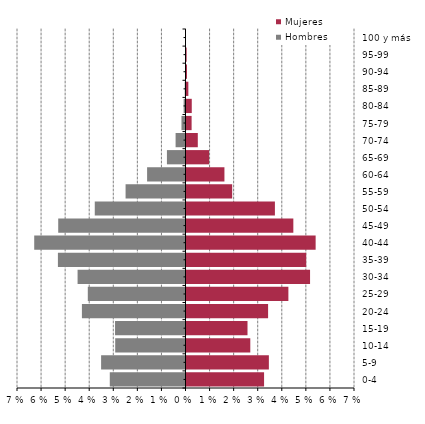
| Category | Hombres | Mujeres |
|---|---|---|
| 0-4 | -0.031 | 0.032 |
| 5-9 | -0.035 | 0.034 |
| 10-14 | -0.029 | 0.027 |
| 15-19 | -0.029 | 0.025 |
| 20-24 | -0.043 | 0.034 |
| 25-29 | -0.041 | 0.042 |
| 30-34 | -0.045 | 0.051 |
| 35-39 | -0.053 | 0.05 |
| 40-44 | -0.063 | 0.054 |
| 45-49 | -0.053 | 0.044 |
| 50-54 | -0.038 | 0.037 |
| 55-59 | -0.025 | 0.019 |
| 60-64 | -0.016 | 0.016 |
| 65-69 | -0.008 | 0.009 |
| 70-74 | -0.004 | 0.005 |
| 75-79 | -0.002 | 0.002 |
| 80-84 | -0.001 | 0.002 |
| 85-89 | 0 | 0.001 |
| 90-94 | 0 | 0 |
| 95-99 | 0 | 0 |
| 100 y más | 0 | 0 |